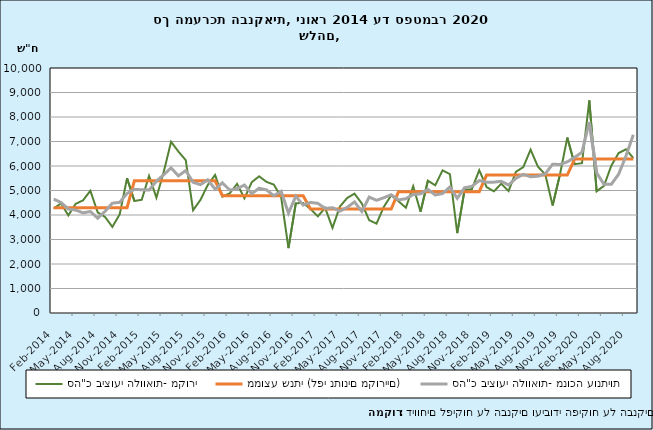
| Category | סה"כ ביצועי הלוואות- מקורי | ממוצע שנתי (לפי נתונים מקוריים) | סה"כ ביצועי הלוואות- מנוכה עונתיות |
|---|---|---|---|
| 2014-02-28 | 4262.255 | 4300.78 | 4651.084 |
| 2014-03-31 | 4474.033 | 4300.78 | 4509.331 |
| 2014-04-30 | 3982.901 | 4300.78 | 4243.923 |
| 2014-05-31 | 4455.752 | 4300.78 | 4200.855 |
| 2014-06-30 | 4597.51 | 4300.78 | 4088.622 |
| 2014-07-31 | 4990.735 | 4300.78 | 4142.747 |
| 2014-08-31 | 4107.263 | 4300.78 | 3870.212 |
| 2014-09-30 | 3921.35 | 4300.78 | 4147.297 |
| 2014-10-31 | 3514.015 | 4300.78 | 4481.743 |
| 2014-11-30 | 4028.095 | 4300.78 | 4516.971 |
| 2014-12-31 | 5503.691 | 4300.78 | 4880.714 |
| 2015-01-31 | 4571.678 | 5395.235 | 5046.08 |
| 2015-02-28 | 4620.799 | 5395.235 | 5030.852 |
| 2015-03-31 | 5598.333 | 5395.235 | 5017.814 |
| 2015-04-30 | 4706.018 | 5395.235 | 5377.666 |
| 2015-05-31 | 5758.492 | 5395.235 | 5644.224 |
| 2015-06-30 | 6989.609 | 5395.235 | 5922.463 |
| 2015-07-31 | 6589.807 | 5395.235 | 5598.948 |
| 2015-08-31 | 6239.136 | 5395.235 | 5814.024 |
| 2015-09-30 | 4193.816 | 5395.235 | 5338.93 |
| 2015-10-31 | 4614.968 | 5395.235 | 5237.466 |
| 2015-11-30 | 5225.496 | 5395.235 | 5436.92 |
| 2015-12-31 | 5634.671 | 5395.235 | 5051.816 |
| 2016-01-31 | 4749.288 | 4787.84 | 5313.684 |
| 2016-02-29 | 4887.666 | 4787.84 | 5014.76 |
| 2016-03-31 | 5270.148 | 4787.84 | 5076.066 |
| 2016-04-30 | 4682.424 | 4787.84 | 5221.924 |
| 2016-05-31 | 5341.393 | 4787.84 | 4870 |
| 2016-06-30 | 5578.193 | 4787.84 | 5092.616 |
| 2016-07-31 | 5352.595 | 4787.84 | 5026.287 |
| 2016-08-31 | 5241.707 | 4787.84 | 4787.932 |
| 2016-09-30 | 4731.688 | 4787.84 | 4967.184 |
| 2016-10-31 | 2647.758 | 4787.84 | 4075.812 |
| 2016-11-30 | 4481.202 | 4787.84 | 4766.852 |
| 2016-12-31 | 4490.01 | 4787.84 | 4404.788 |
| 2017-01-31 | 4248.31 | 4242.381 | 4513.818 |
| 2017-02-28 | 3944.469 | 4242.381 | 4475.801 |
| 2017-03-31 | 4289.487 | 4242.381 | 4269.29 |
| 2017-04-30 | 3473.905 | 4242.381 | 4298.372 |
| 2017-05-31 | 4342.823 | 4242.381 | 4154.749 |
| 2017-06-30 | 4694.724 | 4242.381 | 4310.472 |
| 2017-07-31 | 4871.464 | 4242.381 | 4534.078 |
| 2017-08-31 | 4468.632 | 4242.381 | 4143.45 |
| 2017-09-30 | 3788.691 | 4242.381 | 4732.41 |
| 2017-10-31 | 3648.135 | 4242.381 | 4600.105 |
| 2017-11-30 | 4335.356 | 4242.381 | 4705.508 |
| 2017-12-31 | 4802.58 | 4242.381 | 4826.701 |
| 2018-01-31 | 4559.431 | 4952.046 | 4617.845 |
| 2018-02-28 | 4295.92 | 4952.046 | 4663.43 |
| 2018-03-31 | 5172.816 | 4952.046 | 4837.426 |
| 2018-04-30 | 4132.657 | 4952.046 | 4862.95 |
| 2018-05-31 | 5400.146 | 4952.046 | 5046.979 |
| 2018-06-30 | 5210.652 | 4952.046 | 4816.704 |
| 2018-07-31 | 5820.56 | 4952.046 | 4875.83 |
| 2018-08-31 | 5667.401 | 4952.046 | 5144.636 |
| 2018-09-30 | 3261.965 | 4952.046 | 4680.47 |
| 2018-10-31 | 5018.568 | 4952.046 | 5112.384 |
| 2018-11-30 | 5055.774 | 4952.046 | 5167.976 |
| 2018-12-31 | 5828.665 | 4952.046 | 5405.179 |
| 2019-01-31 | 5139.212 | 5631.438 | 5339.226 |
| 2019-02-28 | 4966.333 | 5631.438 | 5341.705 |
| 2019-03-31 | 5276.03 | 5631.438 | 5375.555 |
| 2019-04-30 | 4979.657 | 5631.438 | 5226.211 |
| 2019-05-31 | 5764.735 | 5631.438 | 5496.442 |
| 2019-06-30 | 5953.594 | 5631.438 | 5659.53 |
| 2019-07-31 | 6668.414 | 5631.438 | 5561.29 |
| 2019-08-31 | 5969.81 | 5631.438 | 5583.99 |
| 2019-09-30 | 5659.203 | 5631.438 | 5680.696 |
| 2019-10-31 | 4389.713 | 5631.438 | 6073.894 |
| 2019-11-30 | 5650.701 | 5631.438 | 6059.779 |
| 2019-12-31 | 7159.851 | 5631.438 | 6169.803 |
| 2020-01-31 | 6075.829 | 6285.464 | 6350.713 |
| 2020-02-29 | 6113.739 | 6285.464 | 6565.084 |
| 2020-03-31 | 8678.812 | 6285.464 | 7797.876 |
| 2020-04-30 | 4966.489 | 6285.464 | 5719.472 |
| 2020-05-31 | 5191.103 | 6285.464 | 5250.024 |
| 2020-06-30 | 6013.627 | 6285.464 | 5253.407 |
| 2020-07-31 | 6528.631 | 6285.464 | 5666.108 |
| 2020-08-31 | 6680.704 | 6285.464 | 6411.018 |
| 2020-09-30 | 6320.246 | 6285.464 | 7276.915 |